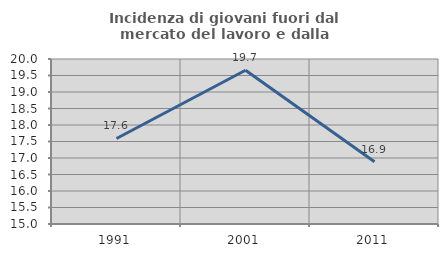
| Category | Incidenza di giovani fuori dal mercato del lavoro e dalla formazione  |
|---|---|
| 1991.0 | 17.592 |
| 2001.0 | 19.658 |
| 2011.0 | 16.888 |